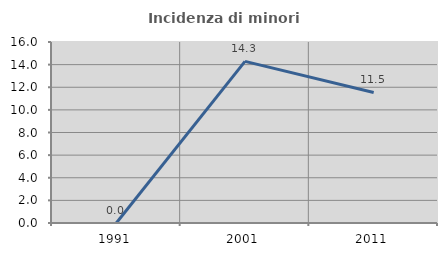
| Category | Incidenza di minori stranieri |
|---|---|
| 1991.0 | 0 |
| 2001.0 | 14.286 |
| 2011.0 | 11.538 |